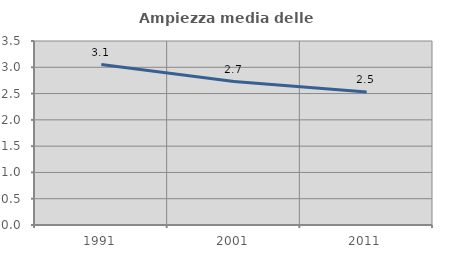
| Category | Ampiezza media delle famiglie |
|---|---|
| 1991.0 | 3.052 |
| 2001.0 | 2.729 |
| 2011.0 | 2.529 |